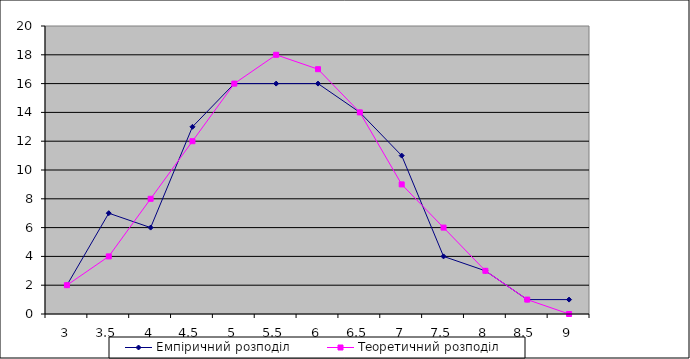
| Category | Емпіричний розподіл | Теоретичний розподіл |
|---|---|---|
| 3.0 | 2 | 2 |
| 3.5 | 7 | 4 |
| 4.0 | 6 | 8 |
| 4.5 | 13 | 12 |
| 5.0 | 16 | 16 |
| 5.5 | 16 | 18 |
| 6.0 | 16 | 17 |
| 6.5 | 14 | 14 |
| 7.0 | 11 | 9 |
| 7.5 | 4 | 6 |
| 8.0 | 3 | 3 |
| 8.5 | 1 | 1 |
| 9.0 | 1 | 0 |